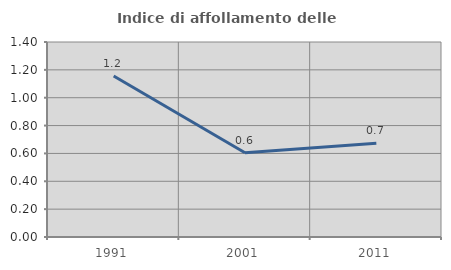
| Category | Indice di affollamento delle abitazioni  |
|---|---|
| 1991.0 | 1.156 |
| 2001.0 | 0.605 |
| 2011.0 | 0.672 |